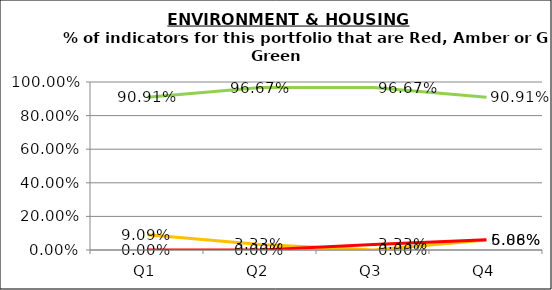
| Category | Green | Amber | Red |
|---|---|---|---|
| Q1 | 0.909 | 0.091 | 0 |
| Q2 | 0.967 | 0.033 | 0 |
| Q3 | 0.967 | 0 | 0.033 |
| Q4 | 0.909 | 0.059 | 0.061 |